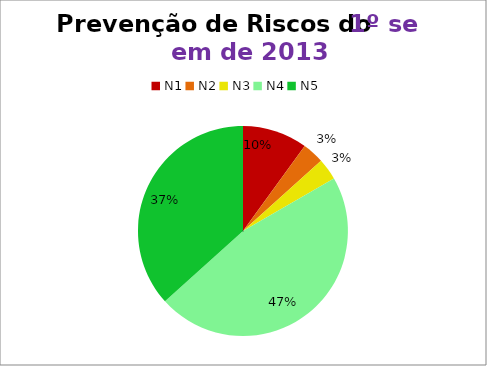
| Category | 1º/13 |
|---|---|
| N1 | 3 |
| N2 | 1 |
| N3 | 1 |
| N4 | 14 |
| N5 | 11 |